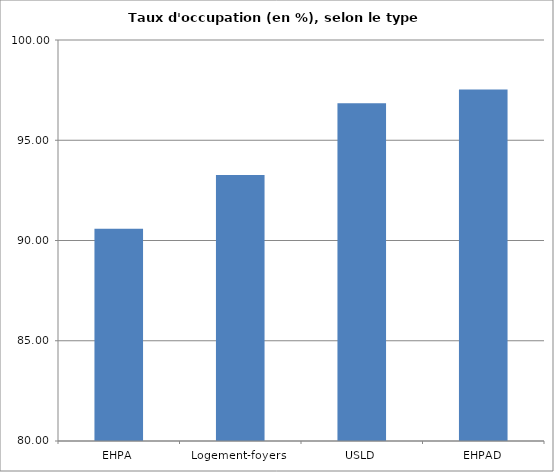
| Category | Taux d’occupation |
|---|---|
| EHPA | 90.588 |
| Logement-foyers  | 93.263 |
| USLD | 96.84 |
| EHPAD | 97.532 |